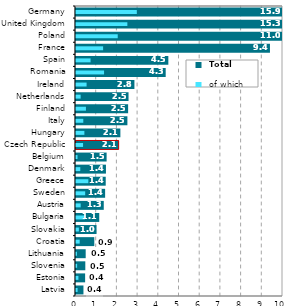
| Category |  Total |
|---|---|
| Latvia | 0.36 |
| Estonia | 0.441 |
| Slovenia | 0.45 |
| Lithuania | 0.468 |
| Croatia | 0.884 |
| Slovakia | 0.992 |
| Bulgaria | 1.123 |
| Austria | 1.341 |
| Sweden | 1.407 |
| Greece | 1.436 |
| Denmark | 1.447 |
| Belgium | 1.479 |
| Czech Republic | 2.06 |
| Hungary | 2.144 |
| Italy | 2.483 |
| Finland | 2.518 |
| Netherlands | 2.538 |
| Ireland | 2.822 |
| Romania | 4.333 |
| Spain | 4.461 |
| France | 9.37 |
| Poland | 10.983 |
| United Kingdom | 15.275 |
| Germany | 15.931 |